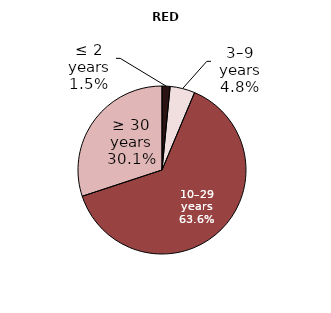
| Category | Red varieties |
|---|---|
| up to 2 years | 85.495 |
| 3–9 years | 263.967 |
| 10–29 years | 3508.774 |
| 30 years and more | 1658.302 |